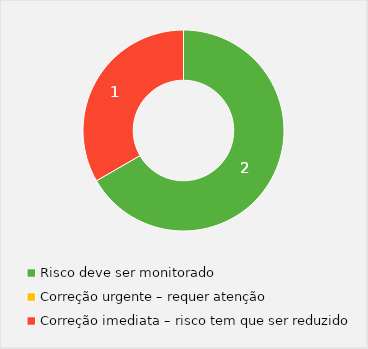
| Category | Quantidade |
|---|---|
| Risco deve ser monitorado | 2 |
| Correção urgente – requer atenção | 0 |
| Correção imediata – risco tem que ser reduzido | 1 |